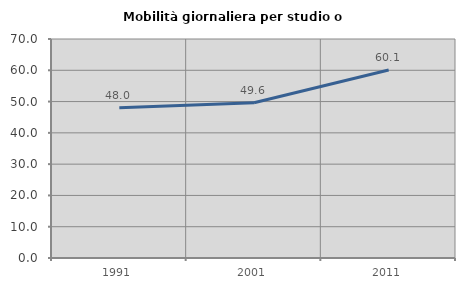
| Category | Mobilità giornaliera per studio o lavoro |
|---|---|
| 1991.0 | 48.009 |
| 2001.0 | 49.64 |
| 2011.0 | 60.09 |